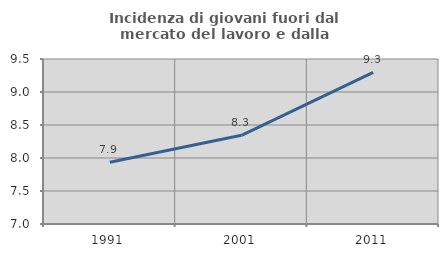
| Category | Incidenza di giovani fuori dal mercato del lavoro e dalla formazione  |
|---|---|
| 1991.0 | 7.935 |
| 2001.0 | 8.344 |
| 2011.0 | 9.299 |